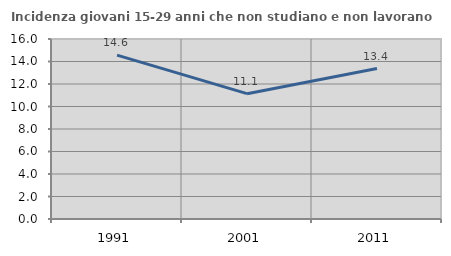
| Category | Incidenza giovani 15-29 anni che non studiano e non lavorano  |
|---|---|
| 1991.0 | 14.568 |
| 2001.0 | 11.141 |
| 2011.0 | 13.376 |